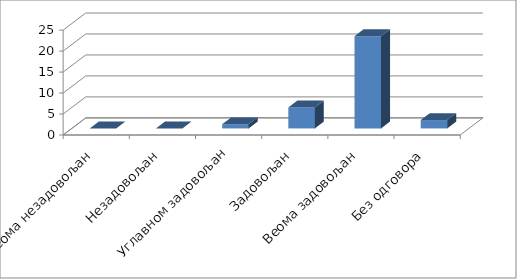
| Category | Series 0 |
|---|---|
| Веома незадовољан | 0 |
| Незадовољан | 0 |
| Углавном задовољан | 1 |
| Задовољан | 5 |
| Веома задовољан | 22 |
| Без одговора | 2 |